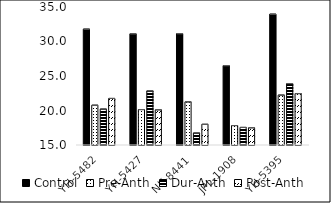
| Category | Control | Pre-Anth | Dur-Anth | Post-Anth |
|---|---|---|---|---|
| YH-5482 | 31.8 | 20.767 | 20.217 | 21.75 |
| YH-5427 | 31.117 | 20.133 | 22.85 | 20.1 |
| NK-8441 | 31.133 | 21.25 | 16.75 | 18 |
| JPL-1908 | 26.5 | 17.817 | 17.55 | 17.5 |
| YH-5395 | 33.967 | 22.233 | 23.9 | 22.45 |